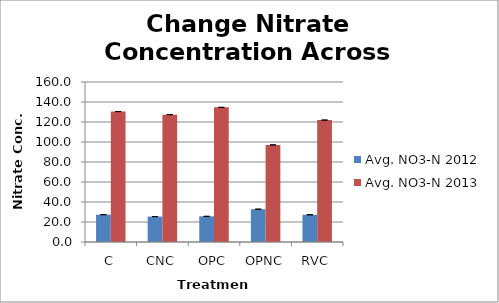
| Category | Avg. NO3-N 2012 | Avg. NO3-N 2013 |
|---|---|---|
| C | 27.354 | 130.4 |
| CNC | 25.421 | 127.333 |
| OPC | 25.659 | 134.629 |
| OPNC | 32.824 | 97.071 |
| RVC | 27.24 | 121.914 |